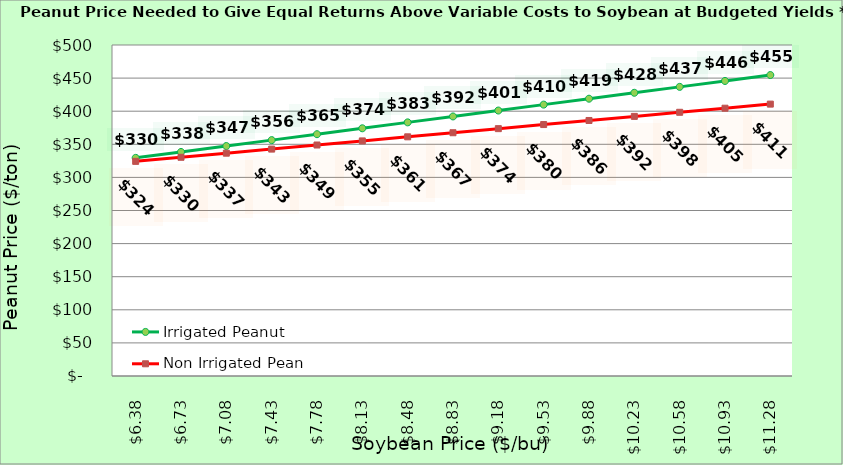
| Category | Irrigated Peanut | Non Irrigated Peanut |
|---|---|---|
| 6.380000000000003 | 329.516 | 324.228 |
| 6.730000000000002 | 338.452 | 330.405 |
| 7.080000000000002 | 347.388 | 336.581 |
| 7.4300000000000015 | 356.325 | 342.758 |
| 7.780000000000001 | 365.261 | 348.934 |
| 8.13 | 374.197 | 355.111 |
| 8.48 | 383.133 | 361.287 |
| 8.83 | 392.069 | 367.464 |
| 9.18 | 401.005 | 373.64 |
| 9.53 | 409.942 | 379.816 |
| 9.879999999999999 | 418.878 | 385.993 |
| 10.229999999999999 | 427.814 | 392.169 |
| 10.579999999999998 | 436.75 | 398.346 |
| 10.929999999999998 | 445.686 | 404.522 |
| 11.279999999999998 | 454.622 | 410.699 |